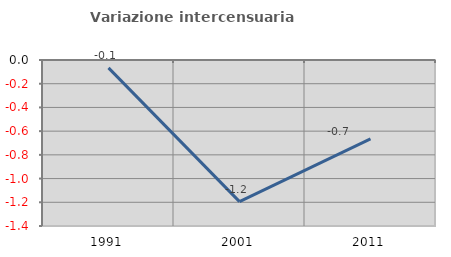
| Category | Variazione intercensuaria annua |
|---|---|
| 1991.0 | -0.066 |
| 2001.0 | -1.194 |
| 2011.0 | -0.664 |